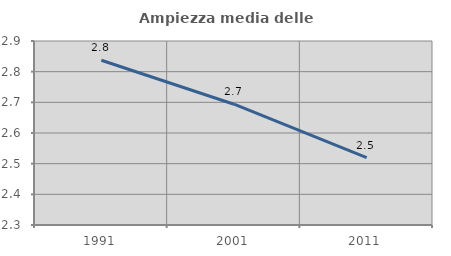
| Category | Ampiezza media delle famiglie |
|---|---|
| 1991.0 | 2.837 |
| 2001.0 | 2.694 |
| 2011.0 | 2.52 |